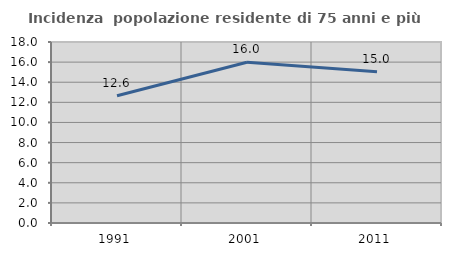
| Category | Incidenza  popolazione residente di 75 anni e più |
|---|---|
| 1991.0 | 12.649 |
| 2001.0 | 15.988 |
| 2011.0 | 15.034 |